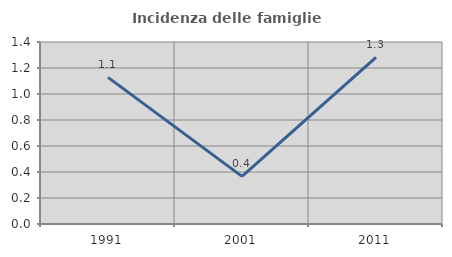
| Category | Incidenza delle famiglie numerose |
|---|---|
| 1991.0 | 1.128 |
| 2001.0 | 0.366 |
| 2011.0 | 1.282 |